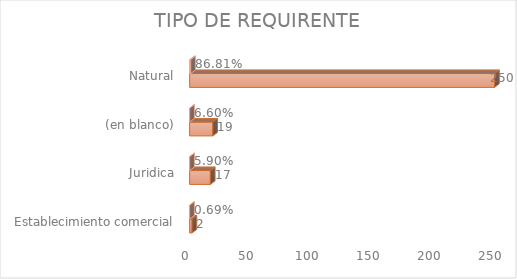
| Category | Cuenta de Número petición | Cuenta de Número petición2 |
|---|---|---|
| Establecimiento comercial | 2 | 0.007 |
| Juridica | 17 | 0.059 |
| (en blanco) | 19 | 0.066 |
| Natural | 250 | 0.868 |